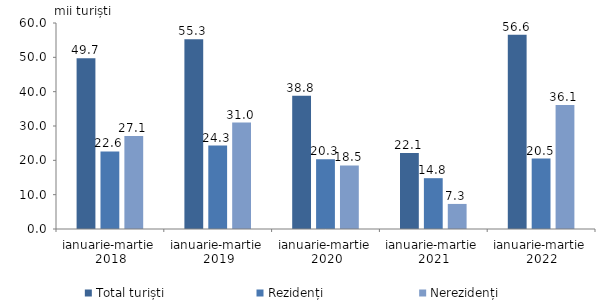
| Category | Total turiști | Rezidenți  | Nerezidenți  |
|---|---|---|---|
| ianuarie-martie 
2018 | 49.7 | 22.6 | 27.1 |
| ianuarie-martie 
2019 | 55.3 | 24.3 | 31 |
| ianuarie-martie 
2020 | 38.8 | 20.3 | 18.5 |
| ianuarie-martie 
2021 | 22.1 | 14.8 | 7.3 |
| ianuarie-martie 
2022 | 56.6 | 20.5 | 36.1 |